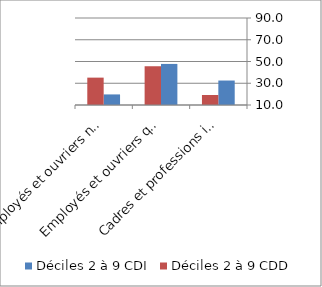
| Category | Déciles 2 à 9 CDI | Déciles 2 à 9 CDD |
|---|---|---|
| Cadres et professions intermédiaires | 32.496 | 19.196 |
| Employés et ouvriers qualifiés | 47.774 | 45.637 |
| Employés et ouvriers non qualifiés | 19.731 | 35.167 |